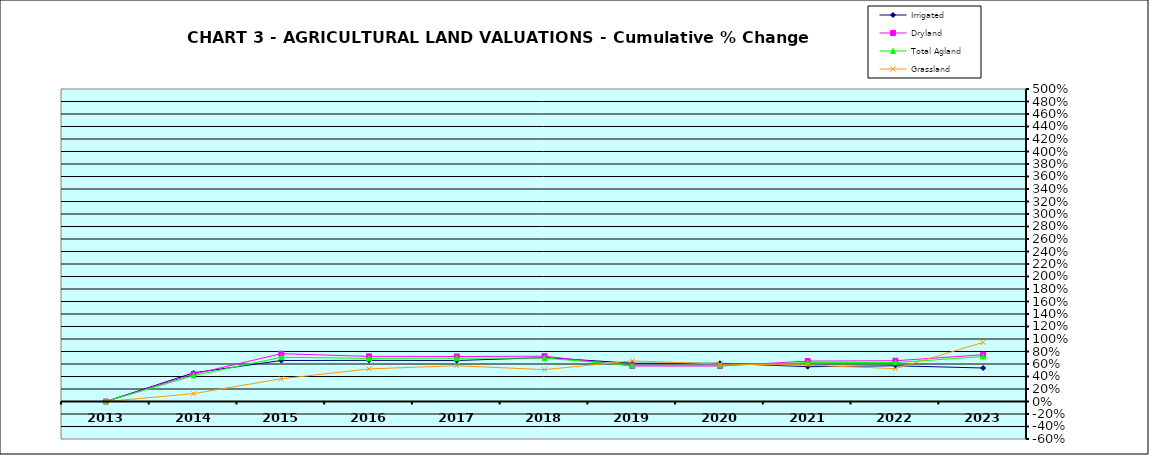
| Category | Irrigated | Dryland | Total Agland | Grassland |
|---|---|---|---|---|
| 2013.0 | 0 | 0 | 0 | 0 |
| 2014.0 | 0.459 | 0.438 | 0.415 | 0.125 |
| 2015.0 | 0.656 | 0.765 | 0.708 | 0.364 |
| 2016.0 | 0.658 | 0.722 | 0.69 | 0.521 |
| 2017.0 | 0.655 | 0.721 | 0.693 | 0.573 |
| 2018.0 | 0.703 | 0.725 | 0.695 | 0.509 |
| 2019.0 | 0.612 | 0.568 | 0.576 | 0.65 |
| 2020.0 | 0.612 | 0.568 | 0.577 | 0.6 |
| 2021.0 | 0.557 | 0.647 | 0.621 | 0.583 |
| 2022.0 | 0.572 | 0.652 | 0.624 | 0.526 |
| 2023.0 | 0.536 | 0.747 | 0.718 | 0.946 |